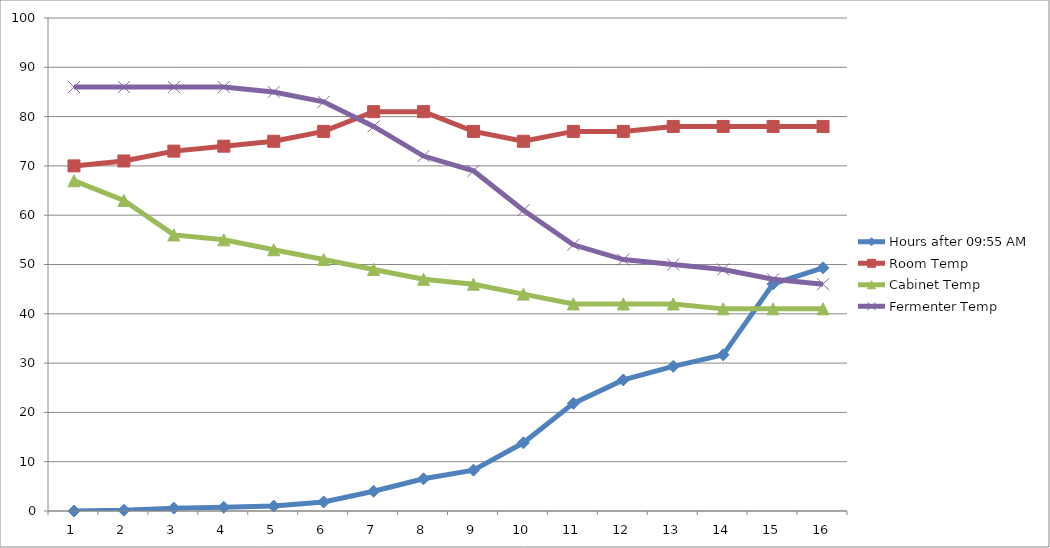
| Category | Hours after 09:55 AM | Room Temp | Cabinet Temp | Fermenter Temp |
|---|---|---|---|---|
| 0 | 0 | 70 | 67 | 86 |
| 1 | 0.167 | 71 | 63 | 86 |
| 2 | 0.583 | 73 | 56 | 86 |
| 3 | 0.75 | 74 | 55 | 86 |
| 4 | 1 | 75 | 53 | 85 |
| 5 | 1.833 | 77 | 51 | 83 |
| 6 | 4 | 81 | 49 | 78 |
| 7 | 6.533 | 81 | 47 | 72 |
| 8 | 8.283 | 77 | 46 | 69 |
| 9 | 13.833 | 75 | 44 | 61 |
| 10 | 21.833 | 77 | 42 | 54 |
| 11 | 26.583 | 77 | 42 | 51 |
| 12 | 29.333 | 78 | 42 | 50 |
| 13 | 31.667 | 78 | 41 | 49 |
| 14 | 46.083 | 78 | 41 | 47 |
| 15 | 49.333 | 78 | 41 | 46 |